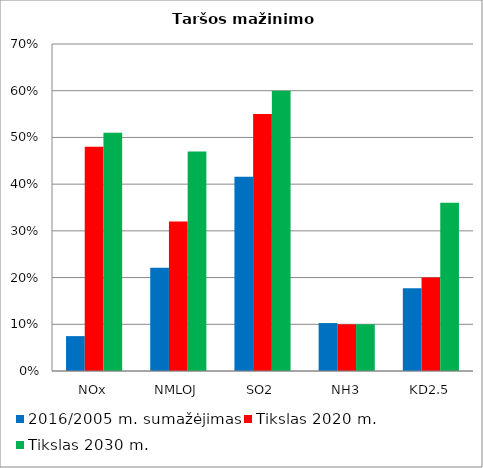
| Category | 2016/2005 m. sumažėjimas | Tikslas 2020 m. | Tikslas 2030 m. |
|---|---|---|---|
| NOx | 0.075 | 0.48 | 0.51 |
| NMLOJ | 0.221 | 0.32 | 0.47 |
| SO2 | 0.416 | 0.55 | 0.6 |
| NH3 | 0.103 | 0.1 | 0.1 |
| ΚD2.5 | 0.177 | 0.2 | 0.36 |